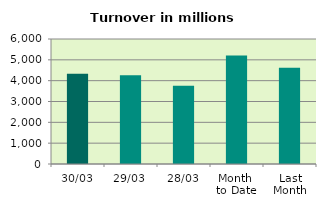
| Category | Series 0 |
|---|---|
| 30/03 | 4327.543 |
| 29/03 | 4255.232 |
| 28/03 | 3755.522 |
| Month 
to Date | 5206.722 |
| Last
Month | 4623.097 |